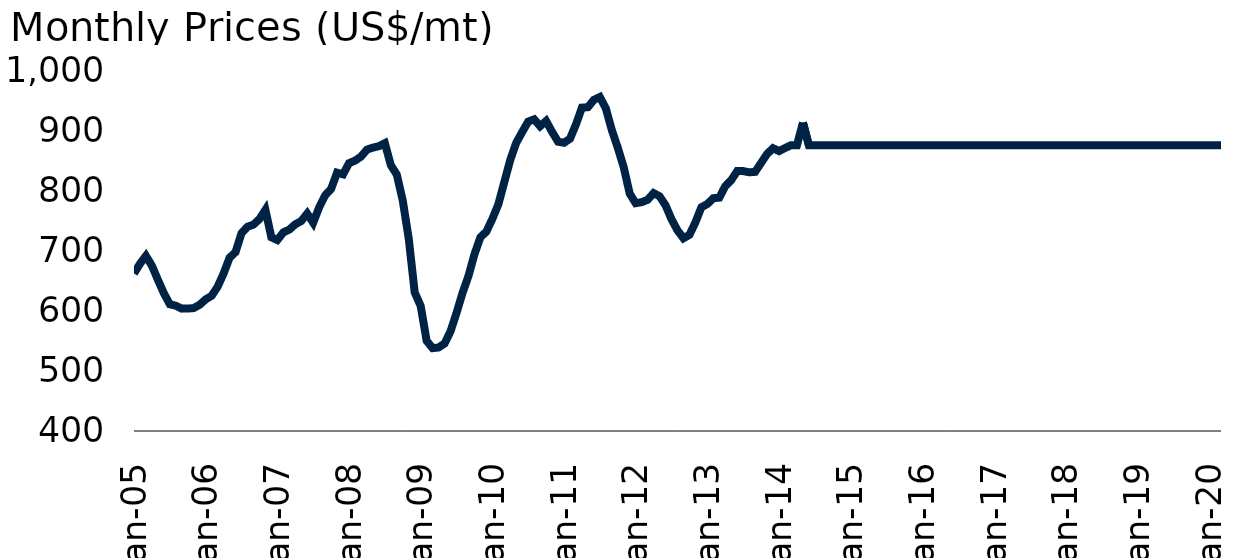
| Category | Woodpulp |
|---|---|
| 2005-01-01 | 661.782 |
| 2005-02-01 | 677.951 |
| 2005-03-01 | 691.069 |
| 2005-04-01 | 674.669 |
| 2005-05-01 | 651.351 |
| 2005-06-01 | 629.033 |
| 2005-07-01 | 610.603 |
| 2005-08-01 | 608.224 |
| 2005-09-01 | 603.393 |
| 2005-10-01 | 603.485 |
| 2005-11-01 | 604.321 |
| 2005-12-01 | 609.845 |
| 2006-01-01 | 618.783 |
| 2006-02-01 | 624.713 |
| 2006-03-01 | 639.804 |
| 2006-04-01 | 661.67 |
| 2006-05-01 | 687.995 |
| 2006-06-01 | 697.332 |
| 2006-07-01 | 728.769 |
| 2006-08-01 | 739.441 |
| 2006-09-01 | 743.03 |
| 2006-10-01 | 752.242 |
| 2006-11-01 | 767.52 |
| 2006-12-01 | 721.93 |
| 2007-01-01 | 717.36 |
| 2007-02-01 | 730.04 |
| 2007-03-01 | 734.74 |
| 2007-04-01 | 743.48 |
| 2007-05-01 | 748.92 |
| 2007-06-01 | 761.35 |
| 2007-07-01 | 746.12 |
| 2007-08-01 | 771.68 |
| 2007-09-01 | 791.67 |
| 2007-10-01 | 802.24 |
| 2007-11-01 | 829.36 |
| 2007-12-01 | 826.6 |
| 2008-01-01 | 845.088 |
| 2008-02-01 | 849.374 |
| 2008-03-01 | 856.002 |
| 2008-04-01 | 867.638 |
| 2008-05-01 | 870.976 |
| 2008-06-01 | 873.405 |
| 2008-07-01 | 878.366 |
| 2008-08-01 | 841.835 |
| 2008-09-01 | 826.182 |
| 2008-10-01 | 782.976 |
| 2008-11-01 | 719.798 |
| 2008-12-01 | 630.333 |
| 2009-01-01 | 607.854 |
| 2009-02-01 | 549.829 |
| 2009-03-01 | 537.705 |
| 2009-04-01 | 538.793 |
| 2009-05-01 | 545.376 |
| 2009-06-01 | 565.704 |
| 2009-07-01 | 596.204 |
| 2009-08-01 | 629.219 |
| 2009-09-01 | 657.62 |
| 2009-10-01 | 693.537 |
| 2009-11-01 | 721.987 |
| 2009-12-01 | 731.368 |
| 2010-01-01 | 752.568 |
| 2010-02-01 | 776.544 |
| 2010-03-01 | 813.738 |
| 2010-04-01 | 850.537 |
| 2010-05-01 | 879.099 |
| 2010-06-01 | 896.949 |
| 2010-07-01 | 914.235 |
| 2010-08-01 | 918.026 |
| 2010-09-01 | 906.586 |
| 2010-10-01 | 915.26 |
| 2010-11-01 | 897.201 |
| 2010-12-01 | 880.793 |
| 2011-01-01 | 879.092 |
| 2011-02-01 | 885.825 |
| 2011-03-01 | 909.635 |
| 2011-04-01 | 937.439 |
| 2011-05-01 | 938.218 |
| 2011-06-01 | 950.426 |
| 2011-07-01 | 955.088 |
| 2011-08-01 | 936.173 |
| 2011-09-01 | 900.225 |
| 2011-10-01 | 870.889 |
| 2011-11-01 | 838.272 |
| 2011-12-01 | 794.497 |
| 2012-01-01 | 778.614 |
| 2012-02-01 | 780.345 |
| 2012-03-01 | 784.22 |
| 2012-04-01 | 795.351 |
| 2012-05-01 | 790.113 |
| 2012-06-01 | 775.07 |
| 2012-07-01 | 751.957 |
| 2012-08-01 | 733.437 |
| 2012-09-01 | 720.289 |
| 2012-10-01 | 726.049 |
| 2012-11-01 | 746.812 |
| 2012-12-01 | 771.872 |
| 2013-01-01 | 777.316 |
| 2013-02-01 | 786.909 |
| 2013-03-01 | 787.861 |
| 2013-04-01 | 806.957 |
| 2013-05-01 | 816.982 |
| 2013-06-01 | 832.018 |
| 2013-07-01 | 832.018 |
| 2013-08-01 | 830 |
| 2013-09-01 | 830.71 |
| 2013-10-01 | 845.65 |
| 2013-11-01 | 860.48 |
| 2013-12-01 | 870 |
| 2014-01-01 | 865.22 |
| 2014-02-01 | 870.25 |
| 2014-03-01 | 875 |
| 2014-04-01 | 875 |
| 2014-05-01 | 912.5 |
| 2014-06-01 | 875 |
| 2014-07-01 | 875 |
| 2014-08-01 | 875 |
| 2014-09-01 | 875 |
| 2014-10-01 | 875 |
| 2014-11-01 | 875 |
| 2014-12-01 | 875 |
| 2015-01-01 | 875 |
| 2015-02-01 | 875 |
| 2015-03-01 | 875 |
| 2015-04-01 | 875 |
| 2015-05-01 | 875 |
| 2015-06-01 | 875 |
| 2015-07-01 | 875 |
| 2015-08-01 | 875 |
| 2015-09-01 | 875 |
| 2015-10-01 | 875 |
| 2015-11-01 | 875 |
| 2015-12-01 | 875 |
| 2016-01-01 | 875 |
| 2016-02-01 | 875 |
| 2016-03-01 | 875 |
| 2016-04-01 | 875 |
| 2016-05-01 | 875 |
| 2016-06-01 | 875 |
| 2016-07-01 | 875 |
| 2016-08-01 | 875 |
| 2016-09-01 | 875 |
| 2016-10-01 | 875 |
| 2016-11-01 | 875 |
| 2016-12-01 | 875 |
| 2017-01-01 | 875 |
| 2017-02-01 | 875 |
| 2017-03-01 | 875 |
| 2017-04-01 | 875 |
| 2017-05-01 | 875 |
| 2017-06-01 | 875 |
| 2017-07-01 | 875 |
| 2017-08-01 | 875 |
| 2017-09-01 | 875 |
| 2017-10-01 | 875 |
| 2017-11-01 | 875 |
| 2017-12-01 | 875 |
| 2018-01-01 | 875 |
| 2018-02-01 | 875 |
| 2018-03-01 | 875 |
| 2018-04-01 | 875 |
| 2018-05-01 | 875 |
| 2018-06-01 | 875 |
| 2018-07-01 | 875 |
| 2018-08-01 | 875 |
| 2018-09-01 | 875 |
| 2018-10-01 | 875 |
| 2018-11-01 | 875 |
| 2018-12-01 | 875 |
| 2019-01-01 | 875 |
| 2019-02-01 | 875 |
| 2019-03-01 | 875 |
| 2019-04-01 | 875 |
| 2019-05-01 | 875 |
| 2019-06-01 | 875 |
| 2019-07-01 | 875 |
| 2019-08-01 | 875 |
| 2019-09-01 | 875 |
| 2019-10-01 | 875 |
| 2019-11-01 | 875 |
| 2019-12-01 | 875 |
| 2020-01-01 | 875 |
| 2020-02-01 | 875 |
| 2020-03-01 | 875 |